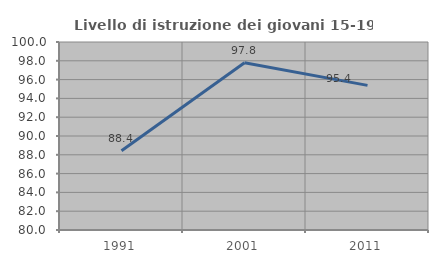
| Category | Livello di istruzione dei giovani 15-19 anni |
|---|---|
| 1991.0 | 88.43 |
| 2001.0 | 97.802 |
| 2011.0 | 95.385 |